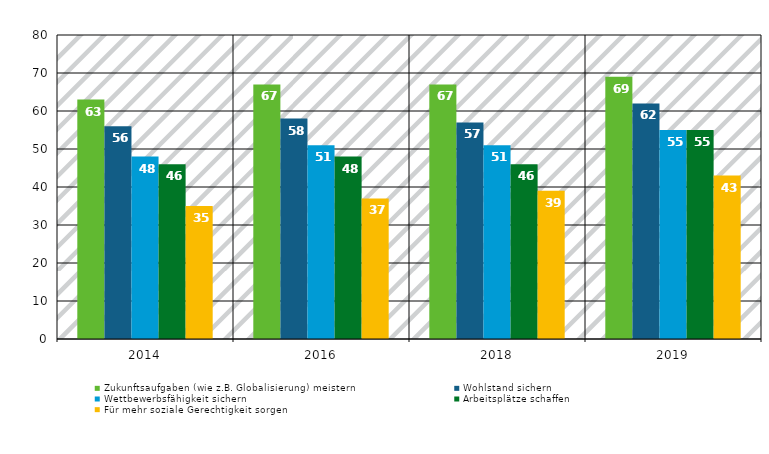
| Category | Zukunftsaufgaben (wie z.B. Globalisierung) meistern | Wohlstand sichern | Wettbewerbsfähigkeit sichern | Arbeitsplätze schaffen | Für mehr soziale Gerechtigkeit sorgen |
|---|---|---|---|---|---|
| 2014.0 | 63 | 56 | 48 | 46 | 35 |
| 2016.0 | 67 | 58 | 51 | 48 | 37 |
| 2018.0 | 67 | 57 | 51 | 46 | 39 |
| 2019.0 | 69 | 62 | 55 | 55 | 43 |